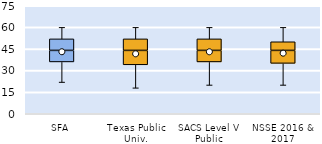
| Category | 25th | 50th | 75th |
|---|---|---|---|
| SFA | 36 | 8 | 8 |
| Texas Public Univ. | 34 | 10 | 8 |
| SACS Level V Public | 36 | 8 | 8 |
| NSSE 2016 & 2017 | 35 | 9 | 6 |